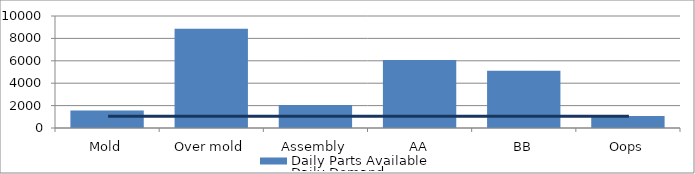
| Category | Daily Parts Available |
|---|---|
| Mold | 1552.086 |
| Over mold | 8869.196 |
| Assembly | 2042.5 |
| AA | 6063 |
| BB | 5106.25 |
| Oops | 1075 |